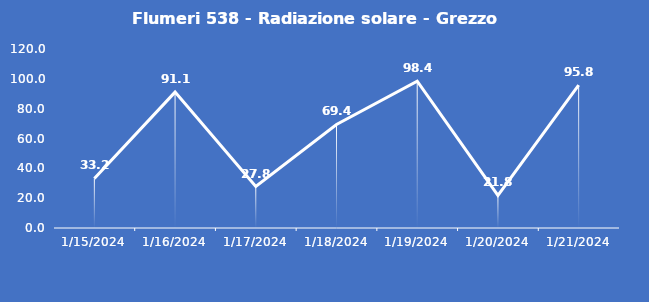
| Category | Flumeri 538 - Radiazione solare - Grezzo (W/m2) |
|---|---|
| 1/15/24 | 33.2 |
| 1/16/24 | 91.1 |
| 1/17/24 | 27.8 |
| 1/18/24 | 69.4 |
| 1/19/24 | 98.4 |
| 1/20/24 | 21.8 |
| 1/21/24 | 95.8 |